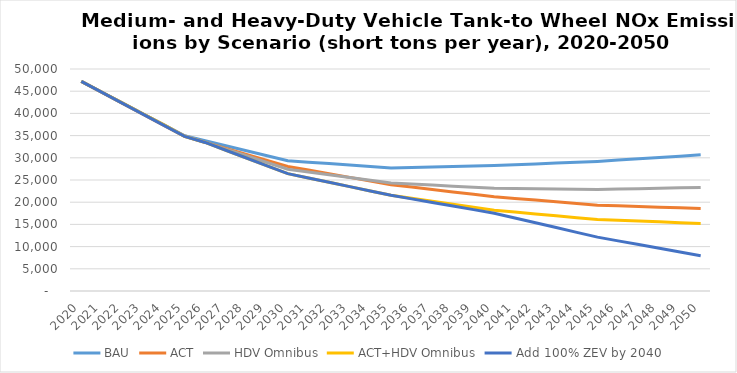
| Category | BAU | ACT | HDV Omnibus | ACT+HDV Omnibus | Add 100% ZEV by 2040 |
|---|---|---|---|---|---|
| 2020.0 | 47220 | 47220 | 47220 | 47220 | 47219.869 |
| 2021.0 | 44770 | 44740 | 44770 | 44770 | 44740 |
| 2022.0 | 42320 | 42260 | 42320 | 42320 | 42260 |
| 2023.0 | 39860 | 39780 | 39860 | 39860 | 39780 |
| 2024.0 | 37410 | 37300 | 37410 | 37410 | 37300 |
| 2025.0 | 34960 | 34820 | 34960 | 34820 | 34819.723 |
| 2026.0 | 33830 | 33470 | 33460 | 33460 | 33460 |
| 2027.0 | 32710 | 32120 | 31950 | 31700 | 31700 |
| 2028.0 | 31580 | 30760 | 30450 | 29950 | 29950 |
| 2029.0 | 30460 | 29410 | 28940 | 28190 | 28190 |
| 2030.0 | 29330 | 28060 | 27440 | 26430 | 26430.685 |
| 2031.0 | 29010 | 27240 | 26820 | 25460 | 25460 |
| 2032.0 | 28690 | 26420 | 26200 | 24480 | 24480 |
| 2033.0 | 28360 | 25590 | 25570 | 23510 | 23510 |
| 2034.0 | 28040 | 24770 | 24950 | 22530 | 22530 |
| 2035.0 | 27720 | 23950 | 24330 | 21560 | 21558.14 |
| 2036.0 | 27820 | 23410 | 24090 | 20890 | 20750 |
| 2037.0 | 27930 | 22860 | 23860 | 20220 | 19940 |
| 2038.0 | 28030 | 22320 | 23620 | 19540 | 19130 |
| 2039.0 | 28140 | 21770 | 23390 | 18870 | 18330 |
| 2040.0 | 28240 | 21230 | 23150 | 18200 | 17518.747 |
| 2041.0 | 28430 | 20850 | 23090 | 17780 | 16440 |
| 2042.0 | 28620 | 20470 | 23030 | 17360 | 15360 |
| 2043.0 | 28810 | 20090 | 22980 | 16940 | 14290 |
| 2044.0 | 29000 | 19710 | 22920 | 16520 | 13210 |
| 2045.0 | 29190 | 19330 | 22860 | 16100 | 12130.213 |
| 2046.0 | 29480 | 19180 | 22950 | 15920 | 11290 |
| 2047.0 | 29780 | 19040 | 23050 | 15740 | 10460 |
| 2048.0 | 30070 | 18890 | 23140 | 15570 | 9620 |
| 2049.0 | 30370 | 18750 | 23240 | 15390 | 8790 |
| 2050.0 | 30660 | 18600 | 23330 | 15210 | 7952.476 |